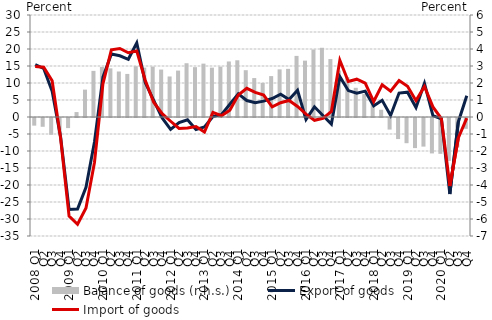
| Category | Balance of goods (r.h.s.) |
|---|---|
| 2008. I. | -0.45 |
|          II. | -0.517 |
|          III. | -0.986 |
|          IV. | -0.919 |
| 2009. I. | -0.594 |
|          II. | 0.29 |
|          III. | 1.61 |
|          IV. | 2.713 |
| 2010. I. | 2.944 |
|          II. | 2.862 |
|          III. | 2.676 |
|          IV. | 2.533 |
| 2011. I. | 2.989 |
|          II. | 2.903 |
|          III. | 2.968 |
|          IV. | 2.79 |
| 2012. I. | 2.384 |
|          II. | 2.73 |
|          III. | 3.163 |
|          IV. | 2.932 |
| 2013. I. | 3.14 |
| II. | 2.903 |
|          III. | 2.964 |
| IV. | 3.266 |
| 2014. I. | 3.336 |
| II. | 2.753 |
|          III. | 2.29 |
| IV. | 2.003 |
| 2015. I. | 2.406 |
| II. | 2.802 |
|          III. | 2.832 |
| IV. | 3.594 |
| 2016. I. | 3.316 |
| II. | 3.971 |
|          III. | 4.072 |
| IV. | 3.409 |
| 2017. I. | 2.731 |
| II. | 2.347 |
|          III. | 1.718 |
| IV. | 1.35 |
| 2018. I. | 1.126 |
| II. | 0.427 |
|          III. | -0.68 |
| IV. | -1.239 |
| 2019. I. | -1.482 |
| II. | -1.771 |
|          III. | -1.683 |
| IV. | -2.084 |